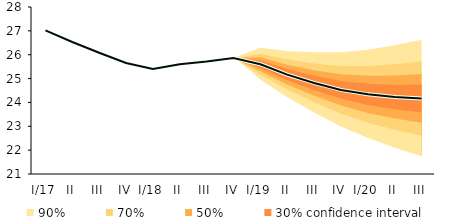
| Category | linka | Centerline |
|---|---|---|
| I/17 | 27.02 | 27.02 |
| II | 26.532 | 26.532 |
| III | 26.084 | 26.084 |
| IV | 25.651 | 25.651 |
| I/18 | 25.402 | 25.402 |
| II | 25.599 | 25.599 |
| III | 25.711 | 25.711 |
| IV | 25.862 | 25.862 |
| I/19 | 25.6 | 25.6 |
| II | 25.166 | 25.166 |
| III | 24.817 | 24.817 |
| IV | 24.524 | 24.524 |
| I/20 | 24.338 | 24.338 |
| II | 24.226 | 24.226 |
| III | 24.167 | 24.167 |